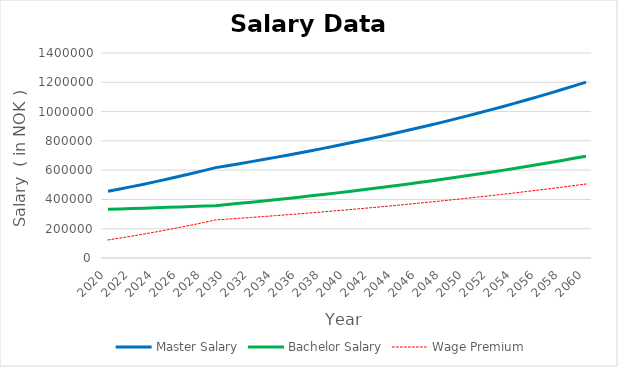
| Category | Master Salary | Bachelor Salary | Wage Premium |
|---|---|---|---|
| 2020.0 | 455805.642 | 332469.881 | 123335.761 |
| 2021.0 | 471422.881 | 335159.396 | 136263.485 |
| 2022.0 | 487575.213 | 337870.668 | 149704.544 |
| 2023.0 | 504280.971 | 340603.873 | 163677.097 |
| 2024.0 | 521559.117 | 343359.189 | 178199.928 |
| 2025.0 | 539429.263 | 346136.793 | 193292.47 |
| 2026.0 | 557911.693 | 348936.867 | 208974.826 |
| 2027.0 | 577027.385 | 351759.592 | 225267.793 |
| 2028.0 | 596798.037 | 354605.152 | 242192.885 |
| 2029.0 | 617246.09 | 357473.731 | 259772.359 |
| 2030.0 | 630640.33 | 365230.911 | 265409.419 |
| 2031.0 | 644325.225 | 373156.421 | 271168.804 |
| 2032.0 | 658307.083 | 381253.916 | 277053.167 |
| 2033.0 | 672592.346 | 389527.126 | 283065.221 |
| 2034.0 | 687187.6 | 397979.864 | 289207.736 |
| 2035.0 | 702099.571 | 406616.027 | 295483.544 |
| 2036.0 | 717335.132 | 415439.595 | 301895.537 |
| 2037.0 | 732901.304 | 424454.634 | 308446.67 |
| 2038.0 | 748805.262 | 433665.3 | 315139.963 |
| 2039.0 | 765054.337 | 443075.837 | 321978.5 |
| 2040.0 | 781656.016 | 452690.583 | 328965.433 |
| 2041.0 | 798617.951 | 462513.968 | 336103.983 |
| 2042.0 | 815947.961 | 472550.521 | 343397.439 |
| 2043.0 | 833654.032 | 482804.868 | 350849.164 |
| 2044.0 | 851744.324 | 493281.733 | 358462.591 |
| 2045.0 | 870227.176 | 503985.947 | 366241.229 |
| 2046.0 | 889111.106 | 514922.442 | 374188.664 |
| 2047.0 | 908404.817 | 526096.259 | 382308.558 |
| 2048.0 | 928117.201 | 537512.548 | 390604.653 |
| 2049.0 | 948257.344 | 549176.57 | 399080.774 |
| 2050.0 | 968834.529 | 561093.702 | 407740.827 |
| 2051.0 | 989858.238 | 573269.435 | 416588.803 |
| 2052.0 | 1011338.162 | 585709.382 | 425628.78 |
| 2053.0 | 1033284.2 | 598419.275 | 434864.925 |
| 2054.0 | 1055706.467 | 611404.974 | 444301.494 |
| 2055.0 | 1078615.297 | 624672.461 | 453942.836 |
| 2056.0 | 1102021.249 | 638227.854 | 463793.395 |
| 2057.0 | 1125935.11 | 652077.398 | 473857.712 |
| 2058.0 | 1150367.902 | 666227.478 | 484140.424 |
| 2059.0 | 1175330.886 | 680684.614 | 494646.272 |
| 2060.0 | 1200835.566 | 695455.47 | 505380.096 |